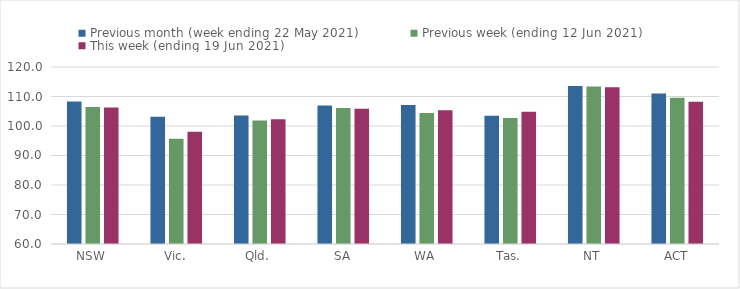
| Category | Previous month (week ending 22 May 2021) | Previous week (ending 12 Jun 2021) | This week (ending 19 Jun 2021) |
|---|---|---|---|
| NSW | 108.32 | 106.43 | 106.27 |
| Vic. | 103.16 | 95.65 | 98.09 |
| Qld. | 103.56 | 101.87 | 102.29 |
| SA | 106.91 | 106.13 | 105.86 |
| WA | 107.13 | 104.38 | 105.35 |
| Tas. | 103.49 | 102.7 | 104.86 |
| NT | 113.59 | 113.4 | 113.14 |
| ACT | 111 | 109.6 | 108.24 |